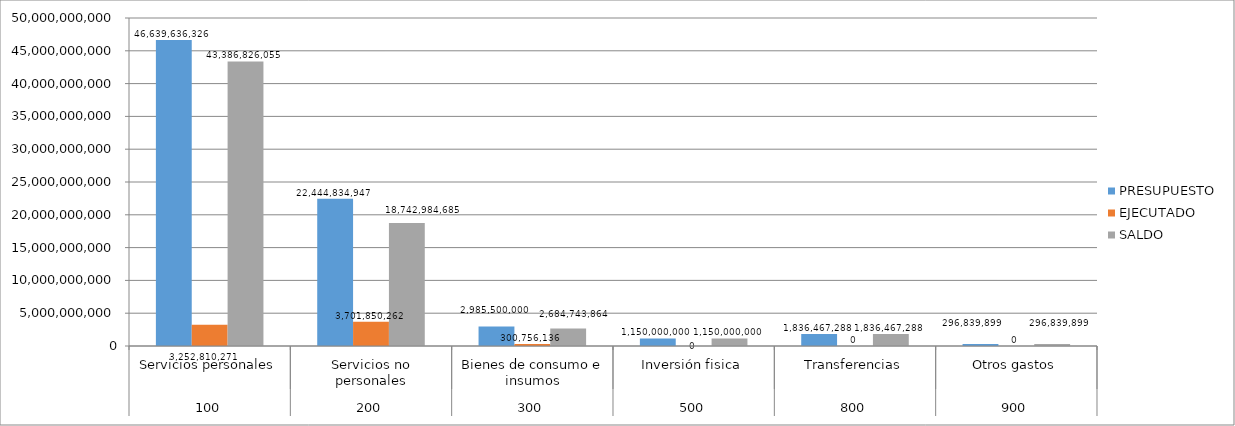
| Category | PRESUPUESTO | EJECUTADO | SALDO |
|---|---|---|---|
| 0 | 46639636326 | 3252810271 | 43386826055 |
| 1 | 22444834947 | 3701850262 | 18742984685 |
| 2 | 2985500000 | 300756136 | 2684743864 |
| 3 | 1150000000 | 0 | 1150000000 |
| 4 | 1836467288 | 0 | 1836467288 |
| 5 | 296839899 | 0 | 296839899 |